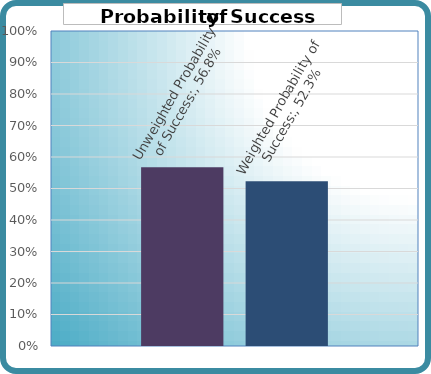
| Category | Unweighted Probability of Success: | Weighted Probability of Success: |
|---|---|---|
| 0 | 0.568 | 0.523 |